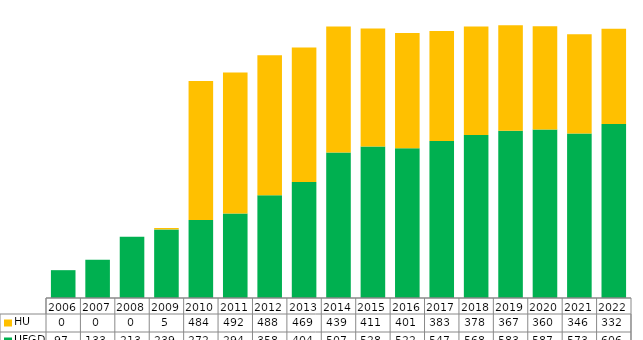
| Category | UFGD | HU |
|---|---|---|
| 2006.0 | 97 | 0 |
| 2007.0 | 133 | 0 |
| 2008.0 | 213 | 0 |
| 2009.0 | 239 | 5 |
| 2010.0 | 272 | 484 |
| 2011.0 | 294 | 492 |
| 2012.0 | 358 | 488 |
| 2013.0 | 404 | 469 |
| 2014.0 | 507 | 439 |
| 2015.0 | 528 | 411 |
| 2016.0 | 522 | 401 |
| 2017.0 | 547 | 383 |
| 2018.0 | 568 | 378 |
| 2019.0 | 583 | 367 |
| 2020.0 | 587 | 360 |
| 2021.0 | 573 | 346 |
| 2022.0 | 606 | 332 |